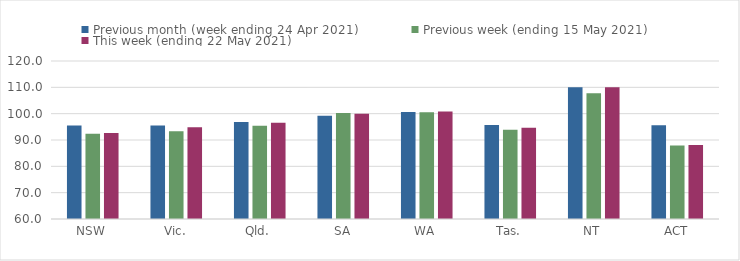
| Category | Previous month (week ending 24 Apr 2021) | Previous week (ending 15 May 2021) | This week (ending 22 May 2021) |
|---|---|---|---|
| NSW | 95.47 | 92.42 | 92.69 |
| Vic. | 95.5 | 93.35 | 94.85 |
| Qld. | 96.87 | 95.37 | 96.54 |
| SA | 99.2 | 100.28 | 100 |
| WA | 100.67 | 100.54 | 100.87 |
| Tas. | 95.66 | 93.87 | 94.62 |
| NT | 110.03 | 107.8 | 110.07 |
| ACT | 95.61 | 87.95 | 88.11 |